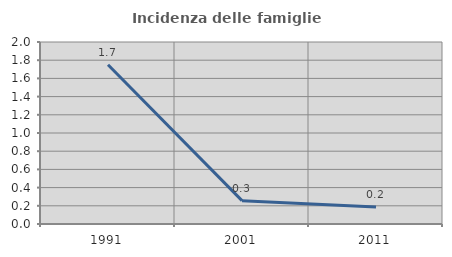
| Category | Incidenza delle famiglie numerose |
|---|---|
| 1991.0 | 1.749 |
| 2001.0 | 0.256 |
| 2011.0 | 0.187 |